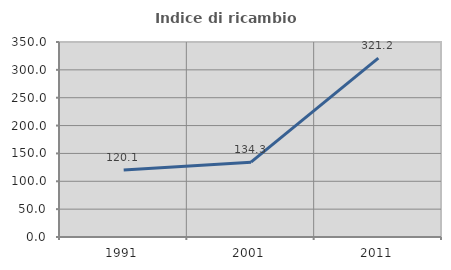
| Category | Indice di ricambio occupazionale  |
|---|---|
| 1991.0 | 120.101 |
| 2001.0 | 134.302 |
| 2011.0 | 321.212 |